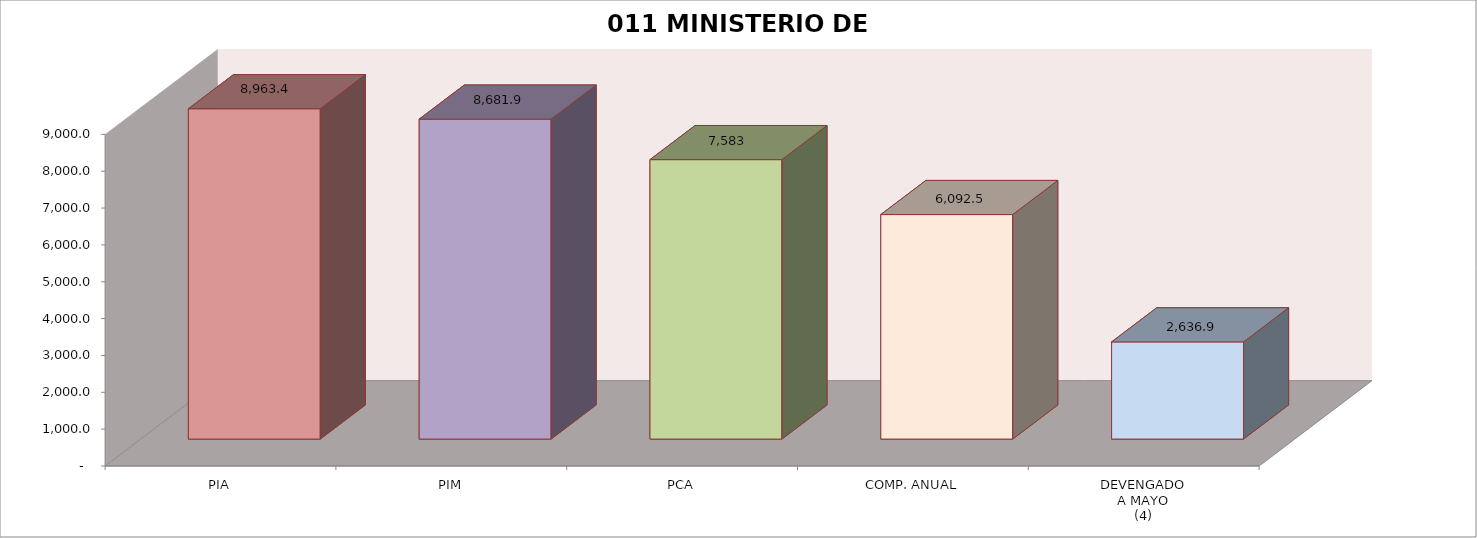
| Category | 011 MINISTERIO DE SALUD |
|---|---|
| PIA | 8963.39 |
| PIM | 8681.939 |
| PCA | 7582.883 |
| COMP. ANUAL | 6092.533 |
| DEVENGADO
A MAYO
(4) | 2636.949 |